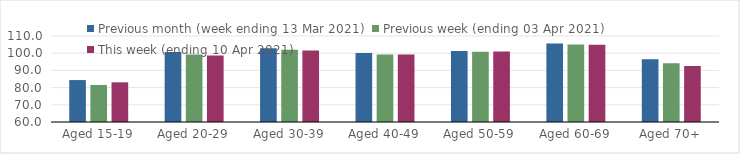
| Category | Previous month (week ending 13 Mar 2021) | Previous week (ending 03 Apr 2021) | This week (ending 10 Apr 2021) |
|---|---|---|---|
| Aged 15-19 | 84.38 | 81.54 | 83.07 |
| Aged 20-29 | 100.76 | 99.3 | 98.61 |
| Aged 30-39 | 102.92 | 101.97 | 101.51 |
| Aged 40-49 | 100.1 | 99.27 | 99.3 |
| Aged 50-59 | 101.33 | 100.8 | 101.05 |
| Aged 60-69 | 105.64 | 105.1 | 104.94 |
| Aged 70+ | 96.41 | 94.21 | 92.63 |